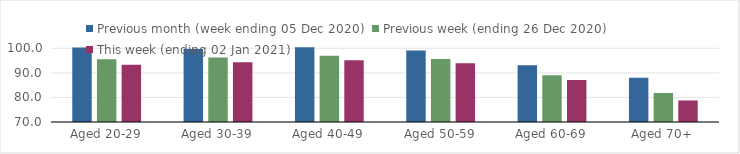
| Category | Previous month (week ending 05 Dec 2020) | Previous week (ending 26 Dec 2020) | This week (ending 02 Jan 2021) |
|---|---|---|---|
| Aged 20-29 | 100.36 | 95.58 | 93.26 |
| Aged 30-39 | 99.74 | 96.21 | 94.27 |
| Aged 40-49 | 100.46 | 96.99 | 95.13 |
| Aged 50-59 | 99.05 | 95.69 | 93.94 |
| Aged 60-69 | 93.05 | 89.02 | 87.09 |
| Aged 70+ | 88.05 | 81.81 | 78.77 |